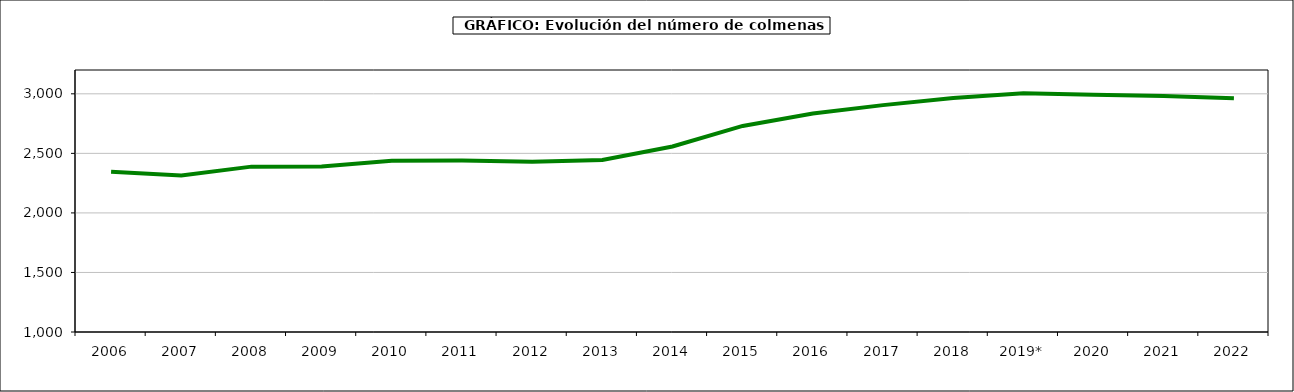
| Category | colmenas |
|---|---|
| 2006 | 2345.368 |
| 2007 | 2313.454 |
| 2008 | 2388.595 |
| 2009 | 2389.999 |
| 2010 | 2438 |
| 2011 | 2439.718 |
| 2012 | 2430.196 |
| 2013 | 2444.097 |
| 2014 | 2557.301 |
| 2015 | 2730.296 |
| 2016 | 2834.514 |
| 2017 | 2904.971 |
| 2018 | 2965.557 |
| 2019* | 3004.184 |
| 2020 | 2992.974 |
| 2021 | 2982.587 |
| 2022 | 2963.302 |